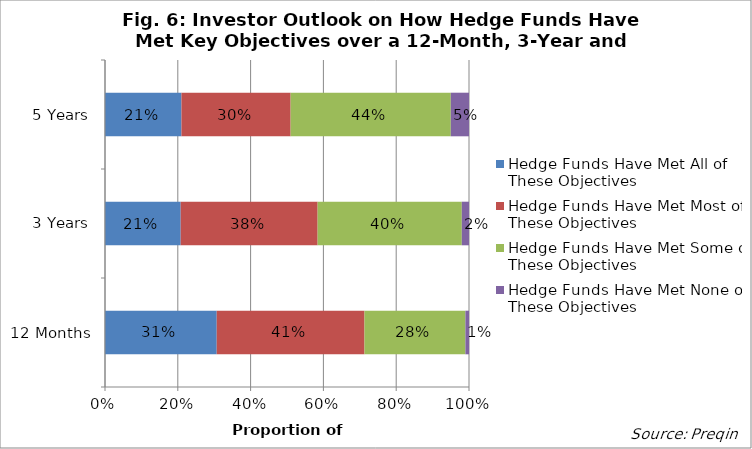
| Category | Hedge Funds Have Met All of These Objectives | Hedge Funds Have Met Most of These Objectives | Hedge Funds Have Met Some of These Objectives | Hedge Funds Have Met None of These Objectives |
|---|---|---|---|---|
| 12 Months | 0.31 | 0.41 | 0.28 | 0.01 |
| 3 Years | 0.21 | 0.38 | 0.4 | 0.02 |
| 5 Years | 0.21 | 0.3 | 0.44 | 0.05 |